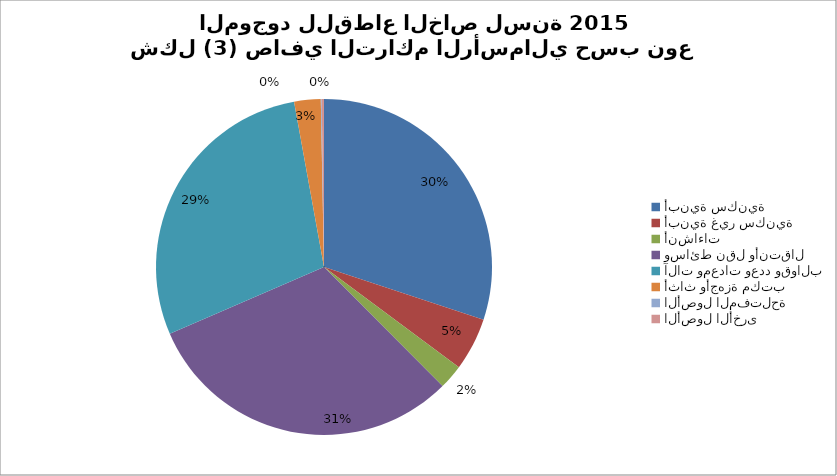
| Category | Series 0 |
|---|---|
| أبنية سكنية | 6455341.445 |
| أبنية غير سكنية | 1090431.31 |
| أنشاءات | 509035.214 |
| وسائط نقل وأنتقال | 6644731.252 |
| آلات ومعدات وعدد وقوالب | 6146836.469 |
| أثاث وأجهزة مكتب | 546902.723 |
| الأصول المفتلحة | 17648.73 |
| الأصول الأخرى  | 47797.709 |